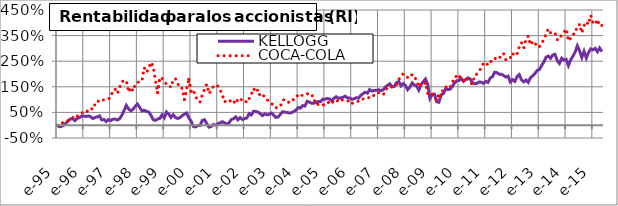
| Category | KELLOGG | COCA-COLA |
|---|---|---|
| 1995-01-01 | 0 | 0 |
| 1995-02-01 | -0.062 | 0.015 |
| 1995-03-01 | -0.045 | 0.073 |
| 1995-04-01 | 0.011 | 0.126 |
| 1995-05-01 | 0.08 | 0.123 |
| 1995-06-01 | 0.178 | 0.189 |
| 1995-07-01 | 0.245 | 0.262 |
| 1995-08-01 | 0.249 | 0.301 |
| 1995-09-01 | 0.178 | 0.255 |
| 1995-10-01 | 0.274 | 0.352 |
| 1995-11-01 | 0.292 | 0.409 |
| 1995-12-01 | 0.355 | 0.492 |
| 1996-01-01 | 0.36 | 0.462 |
| 1996-02-01 | 0.34 | 0.486 |
| 1996-03-01 | 0.362 | 0.617 |
| 1996-04-01 | 0.331 | 0.664 |
| 1996-05-01 | 0.258 | 0.615 |
| 1996-06-01 | 0.301 | 0.827 |
| 1996-07-01 | 0.325 | 0.956 |
| 1996-08-01 | 0.363 | 0.906 |
| 1996-09-01 | 0.208 | 0.98 |
| 1996-10-01 | 0.221 | 0.99 |
| 1996-11-01 | 0.143 | 0.995 |
| 1996-12-01 | 0.22 | 1.025 |
| 1997-01-01 | 0.181 | 1.094 |
| 1997-02-01 | 0.235 | 1.368 |
| 1997-03-01 | 0.238 | 1.403 |
| 1997-04-01 | 0.202 | 1.239 |
| 1997-05-01 | 0.257 | 1.478 |
| 1997-06-01 | 0.389 | 1.697 |
| 1997-07-01 | 0.577 | 1.743 |
| 1997-08-01 | 0.775 | 1.743 |
| 1997-09-01 | 0.638 | 1.291 |
| 1997-10-01 | 0.56 | 1.482 |
| 1997-11-01 | 0.62 | 1.334 |
| 1997-12-01 | 0.736 | 1.593 |
| 1998-01-01 | 0.826 | 1.678 |
| 1998-02-01 | 0.692 | 1.678 |
| 1998-03-01 | 0.56 | 1.731 |
| 1998-04-01 | 0.583 | 2.245 |
| 1998-05-01 | 0.539 | 2.066 |
| 1998-06-01 | 0.513 | 2.199 |
| 1998-07-01 | 0.395 | 2.457 |
| 1998-08-01 | 0.22 | 2.311 |
| 1998-09-01 | 0.19 | 1.752 |
| 1998-10-01 | 0.241 | 1.273 |
| 1998-11-01 | 0.264 | 1.87 |
| 1998-12-01 | 0.407 | 1.83 |
| 1999-01-01 | 0.287 | 1.714 |
| 1999-02-01 | 0.518 | 1.592 |
| 1999-03-01 | 0.433 | 1.579 |
| 1999-04-01 | 0.302 | 1.474 |
| 1999-05-01 | 0.409 | 1.801 |
| 1999-06-01 | 0.302 | 1.806 |
| 1999-07-01 | 0.261 | 1.64 |
| 1999-08-01 | 0.297 | 1.444 |
| 1999-09-01 | 0.371 | 1.442 |
| 1999-10-01 | 0.428 | 1.003 |
| 1999-11-01 | 0.476 | 1.408 |
| 1999-12-01 | 0.284 | 1.79 |
| 2000-01-01 | 0.158 | 1.307 |
| 2000-02-01 | -0.048 | 1.378 |
| 2000-03-01 | -0.069 | 1.087 |
| 2000-04-01 | -0.013 | 1.025 |
| 2000-05-01 | -0.015 | 0.9 |
| 2000-06-01 | 0.186 | 1.187 |
| 2000-07-01 | 0.215 | 1.405 |
| 2000-08-01 | 0.067 | 1.601 |
| 2000-09-01 | -0.076 | 1.235 |
| 2000-10-01 | -0.046 | 1.356 |
| 2000-11-01 | 0.026 | 1.516 |
| 2000-12-01 | 0.001 | 1.578 |
| 2001-01-01 | 0.059 | 1.526 |
| 2001-02-01 | 0.088 | 1.381 |
| 2001-03-01 | 0.137 | 1.184 |
| 2001-04-01 | 0.09 | 0.907 |
| 2001-05-01 | 0.042 | 0.982 |
| 2001-06-01 | 0.094 | 0.989 |
| 2001-07-01 | 0.221 | 0.905 |
| 2001-08-01 | 0.254 | 0.841 |
| 2001-09-01 | 0.326 | 1.033 |
| 2001-10-01 | 0.207 | 0.932 |
| 2001-11-01 | 0.295 | 1.037 |
| 2001-12-01 | 0.225 | 0.958 |
| 2002-01-01 | 0.258 | 0.984 |
| 2002-02-01 | 0.284 | 0.88 |
| 2002-03-01 | 0.452 | 1.037 |
| 2002-04-01 | 0.401 | 1.21 |
| 2002-05-01 | 0.546 | 1.435 |
| 2002-06-01 | 0.539 | 1.283 |
| 2002-07-01 | 0.51 | 1.39 |
| 2002-08-01 | 0.448 | 1.117 |
| 2002-09-01 | 0.374 | 1.163 |
| 2002-10-01 | 0.447 | 1.131 |
| 2002-11-01 | 0.404 | 0.994 |
| 2002-12-01 | 0.423 | 0.933 |
| 2003-01-01 | 0.475 | 0.875 |
| 2003-02-01 | 0.391 | 0.717 |
| 2003-03-01 | 0.302 | 0.677 |
| 2003-04-01 | 0.322 | 0.737 |
| 2003-05-01 | 0.427 | 0.739 |
| 2003-06-01 | 0.526 | 0.97 |
| 2003-07-01 | 0.511 | 1.009 |
| 2003-08-01 | 0.497 | 0.934 |
| 2003-09-01 | 0.477 | 0.881 |
| 2003-10-01 | 0.491 | 0.906 |
| 2003-11-01 | 0.537 | 1.027 |
| 2003-12-01 | 0.589 | 1.052 |
| 2004-01-01 | 0.689 | 1.214 |
| 2004-02-01 | 0.666 | 1.165 |
| 2004-03-01 | 0.767 | 1.165 |
| 2004-04-01 | 0.749 | 1.218 |
| 2004-05-01 | 0.934 | 1.22 |
| 2004-06-01 | 0.901 | 1.24 |
| 2004-07-01 | 0.858 | 1.219 |
| 2004-08-01 | 0.862 | 0.948 |
| 2004-09-01 | 0.888 | 0.967 |
| 2004-10-01 | 0.929 | 0.787 |
| 2004-11-01 | 0.923 | 0.797 |
| 2004-12-01 | 1.012 | 0.774 |
| 2005-01-01 | 1.015 | 0.853 |
| 2005-02-01 | 1.042 | 0.848 |
| 2005-03-01 | 1.028 | 0.93 |
| 2005-04-01 | 0.951 | 0.858 |
| 2005-05-01 | 1.052 | 0.956 |
| 2005-06-01 | 1.114 | 1.002 |
| 2005-07-01 | 1.051 | 0.907 |
| 2005-08-01 | 1.067 | 0.982 |
| 2005-09-01 | 1.087 | 0.983 |
| 2005-10-01 | 1.135 | 0.965 |
| 2005-11-01 | 1.066 | 0.94 |
| 2005-12-01 | 1.067 | 0.961 |
| 2006-01-01 | 1.01 | 0.845 |
| 2006-02-01 | 1.031 | 0.9 |
| 2006-03-01 | 1.074 | 0.937 |
| 2006-04-01 | 1.06 | 0.931 |
| 2006-05-01 | 1.165 | 0.935 |
| 2006-06-01 | 1.232 | 1.025 |
| 2006-07-01 | 1.29 | 1.014 |
| 2006-08-01 | 1.251 | 1.058 |
| 2006-09-01 | 1.392 | 1.093 |
| 2006-10-01 | 1.332 | 1.081 |
| 2006-11-01 | 1.357 | 1.181 |
| 2006-12-01 | 1.362 | 1.192 |
| 2007-01-01 | 1.384 | 1.271 |
| 2007-02-01 | 1.352 | 1.264 |
| 2007-03-01 | 1.381 | 1.19 |
| 2007-04-01 | 1.487 | 1.301 |
| 2007-05-01 | 1.557 | 1.496 |
| 2007-06-01 | 1.617 | 1.504 |
| 2007-07-01 | 1.493 | 1.509 |
| 2007-08-01 | 1.514 | 1.543 |
| 2007-09-01 | 1.661 | 1.567 |
| 2007-10-01 | 1.71 | 1.78 |
| 2007-11-01 | 1.54 | 1.924 |
| 2007-12-01 | 1.622 | 2.003 |
| 2008-01-01 | 1.554 | 1.963 |
| 2008-02-01 | 1.388 | 1.861 |
| 2008-03-01 | 1.486 | 1.85 |
| 2008-04-01 | 1.652 | 1.985 |
| 2008-05-01 | 1.57 | 1.871 |
| 2008-06-01 | 1.534 | 1.77 |
| 2008-07-01 | 1.369 | 1.495 |
| 2008-08-01 | 1.587 | 1.599 |
| 2008-09-01 | 1.701 | 1.547 |
| 2008-10-01 | 1.805 | 1.668 |
| 2008-11-01 | 1.596 | 1.239 |
| 2008-12-01 | 1.047 | 1.202 |
| 2009-01-01 | 1.194 | 1.249 |
| 2009-02-01 | 1.209 | 1.098 |
| 2009-03-01 | 0.916 | 0.971 |
| 2009-04-01 | 0.897 | 1.251 |
| 2009-05-01 | 1.19 | 1.131 |
| 2009-06-01 | 1.23 | 1.46 |
| 2009-07-01 | 1.419 | 1.489 |
| 2009-08-01 | 1.388 | 1.51 |
| 2009-09-01 | 1.407 | 1.456 |
| 2009-10-01 | 1.506 | 1.71 |
| 2009-11-01 | 1.654 | 1.74 |
| 2009-12-01 | 1.735 | 1.984 |
| 2010-01-01 | 1.747 | 1.928 |
| 2010-02-01 | 1.826 | 1.794 |
| 2010-03-01 | 1.713 | 1.737 |
| 2010-04-01 | 1.788 | 1.864 |
| 2010-05-01 | 1.847 | 1.785 |
| 2010-06-01 | 1.807 | 1.657 |
| 2010-07-01 | 1.659 | 1.614 |
| 2010-08-01 | 1.619 | 1.947 |
| 2010-09-01 | 1.635 | 1.994 |
| 2010-10-01 | 1.688 | 2.112 |
| 2010-11-01 | 1.68 | 2.248 |
| 2010-12-01 | 1.632 | 2.429 |
| 2011-01-01 | 1.709 | 2.457 |
| 2011-02-01 | 1.673 | 2.342 |
| 2011-03-01 | 1.843 | 2.44 |
| 2011-04-01 | 1.897 | 2.589 |
| 2011-05-01 | 2.072 | 2.615 |
| 2011-06-01 | 2.05 | 2.564 |
| 2011-07-01 | 1.993 | 2.661 |
| 2011-08-01 | 1.989 | 2.642 |
| 2011-09-01 | 1.939 | 2.788 |
| 2011-10-01 | 1.88 | 2.542 |
| 2011-11-01 | 1.917 | 2.629 |
| 2011-12-01 | 1.691 | 2.644 |
| 2012-01-01 | 1.779 | 2.815 |
| 2012-02-01 | 1.71 | 2.699 |
| 2012-03-01 | 1.895 | 2.795 |
| 2012-04-01 | 1.977 | 3.071 |
| 2012-05-01 | 1.77 | 3.225 |
| 2012-06-01 | 1.695 | 3.014 |
| 2012-07-01 | 1.763 | 3.364 |
| 2012-08-01 | 1.672 | 3.479 |
| 2012-09-01 | 1.855 | 3.136 |
| 2012-10-01 | 1.927 | 3.273 |
| 2012-11-01 | 2.016 | 3.156 |
| 2012-12-01 | 2.14 | 3.19 |
| 2013-01-01 | 2.173 | 3.063 |
| 2013-02-01 | 2.332 | 3.208 |
| 2013-03-01 | 2.467 | 3.338 |
| 2013-04-01 | 2.659 | 3.567 |
| 2013-05-01 | 2.698 | 3.766 |
| 2013-06-01 | 2.609 | 3.608 |
| 2013-07-01 | 2.739 | 3.6 |
| 2013-08-01 | 2.77 | 3.612 |
| 2013-09-01 | 2.525 | 3.34 |
| 2013-10-01 | 2.411 | 3.346 |
| 2013-11-01 | 2.617 | 3.536 |
| 2013-12-01 | 2.545 | 3.622 |
| 2014-01-01 | 2.573 | 3.763 |
| 2014-02-01 | 2.329 | 3.29 |
| 2014-03-01 | 2.549 | 3.396 |
| 2014-04-01 | 2.691 | 3.464 |
| 2014-05-01 | 2.853 | 3.74 |
| 2014-06-01 | 3.101 | 3.749 |
| 2014-07-01 | 2.908 | 3.952 |
| 2014-08-01 | 2.646 | 3.601 |
| 2014-09-01 | 2.884 | 3.885 |
| 2014-10-01 | 2.626 | 4.041 |
| 2014-11-01 | 2.832 | 3.932 |
| 2014-12-01 | 2.981 | 4.291 |
| 2015-01-01 | 2.942 | 4.014 |
| 2015-02-01 | 3.004 | 3.939 |
| 2015-03-01 | 2.873 | 4.131 |
| 2015-04-01 | 3.017 | 3.871 |
| 2015-05-01 | 2.878 | 3.898 |